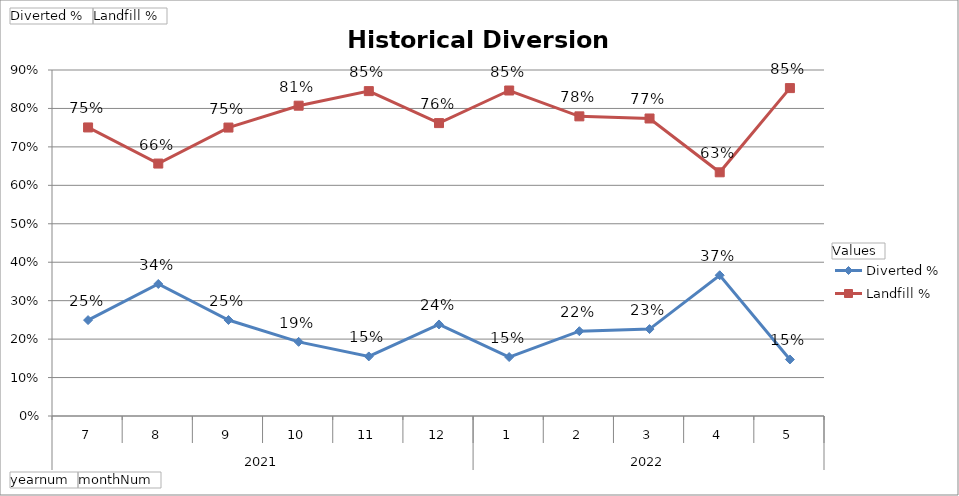
| Category | Diverted % | Landfill % |
|---|---|---|
| 0 | 0.249 | 0.751 |
| 1 | 0.343 | 0.657 |
| 2 | 0.25 | 0.75 |
| 3 | 0.193 | 0.807 |
| 4 | 0.155 | 0.845 |
| 5 | 0.238 | 0.762 |
| 6 | 0.153 | 0.847 |
| 7 | 0.221 | 0.779 |
| 8 | 0.226 | 0.774 |
| 9 | 0.366 | 0.634 |
| 10 | 0.147 | 0.853 |